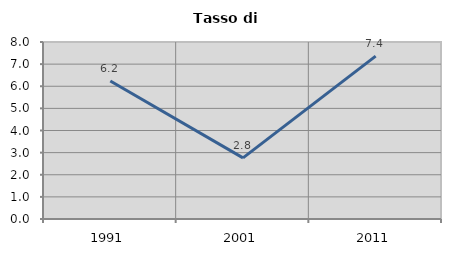
| Category | Tasso di disoccupazione   |
|---|---|
| 1991.0 | 6.239 |
| 2001.0 | 2.761 |
| 2011.0 | 7.362 |